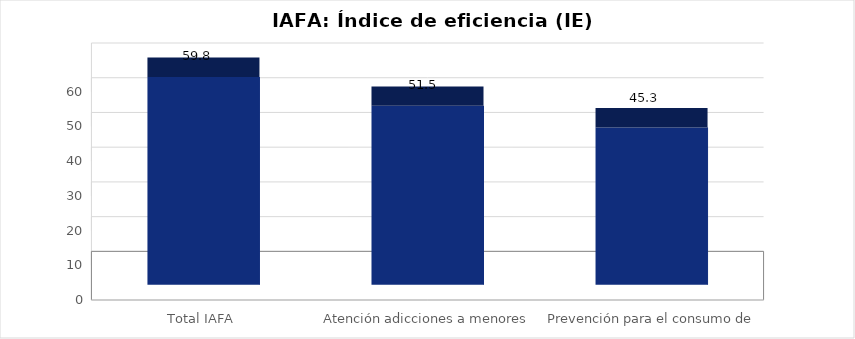
| Category | Índice de eficiencia (IE)  |
|---|---|
| Total IAFA | 59.81 |
| Atención adicciones a menores de edad | 51.506 |
| Prevención para el consumo de drogas | 45.27 |